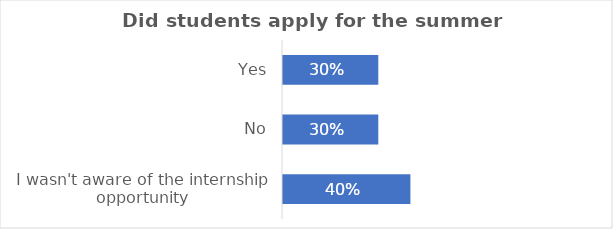
| Category | Series 0 |
|---|---|
| Yes | 0.3 |
| No | 0.3 |
| I wasn't aware of the internship opportunity | 0.4 |